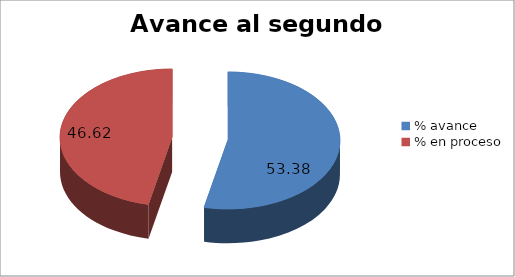
| Category | Series 0 |
|---|---|
| % avance | 53.379 |
| % en proceso | 46.621 |